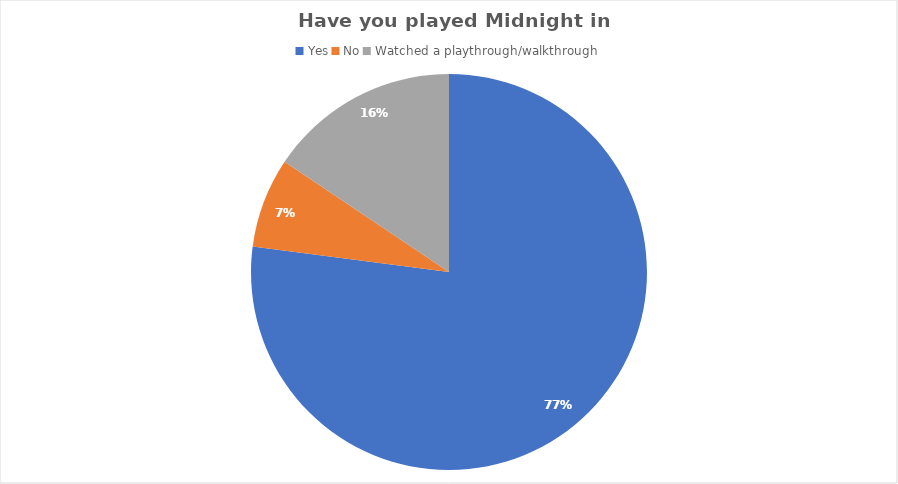
| Category | Series 0 |
|---|---|
| Yes | 84 |
| No | 8 |
| Watched a playthrough/walkthrough | 17 |